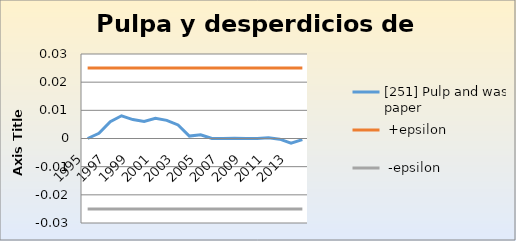
| Category | [251] Pulp and waste paper |  +epsilon |  -epsilon |
|---|---|---|---|
| 1995.0 | 0 | 0.025 | -0.025 |
| 1996.0 | 0.002 | 0.025 | -0.025 |
| 1997.0 | 0.006 | 0.025 | -0.025 |
| 1998.0 | 0.008 | 0.025 | -0.025 |
| 1999.0 | 0.007 | 0.025 | -0.025 |
| 2000.0 | 0.006 | 0.025 | -0.025 |
| 2001.0 | 0.007 | 0.025 | -0.025 |
| 2002.0 | 0.006 | 0.025 | -0.025 |
| 2003.0 | 0.005 | 0.025 | -0.025 |
| 2004.0 | 0.001 | 0.025 | -0.025 |
| 2005.0 | 0.001 | 0.025 | -0.025 |
| 2006.0 | 0 | 0.025 | -0.025 |
| 2007.0 | 0 | 0.025 | -0.025 |
| 2008.0 | 0 | 0.025 | -0.025 |
| 2009.0 | 0 | 0.025 | -0.025 |
| 2010.0 | 0 | 0.025 | -0.025 |
| 2011.0 | 0 | 0.025 | -0.025 |
| 2012.0 | 0 | 0.025 | -0.025 |
| 2013.0 | -0.002 | 0.025 | -0.025 |
| 2014.0 | 0 | 0.025 | -0.025 |